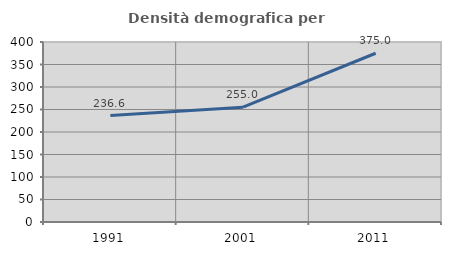
| Category | Densità demografica |
|---|---|
| 1991.0 | 236.602 |
| 2001.0 | 255.044 |
| 2011.0 | 374.977 |